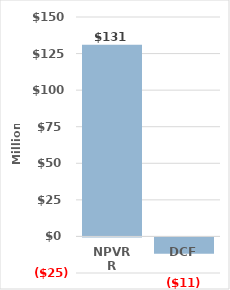
| Category | Series 0 |
|---|---|
| NPVRR | 131.078 |
| DCF | -11.182 |